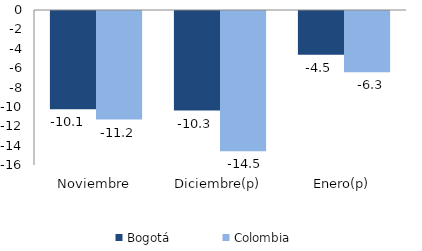
| Category | Bogotá | Colombia |
|---|---|---|
| Noviembre | -10.141 | -11.204 |
| Diciembre(p) | -10.283 | -14.469 |
| Enero(p) | -4.512 | -6.327 |